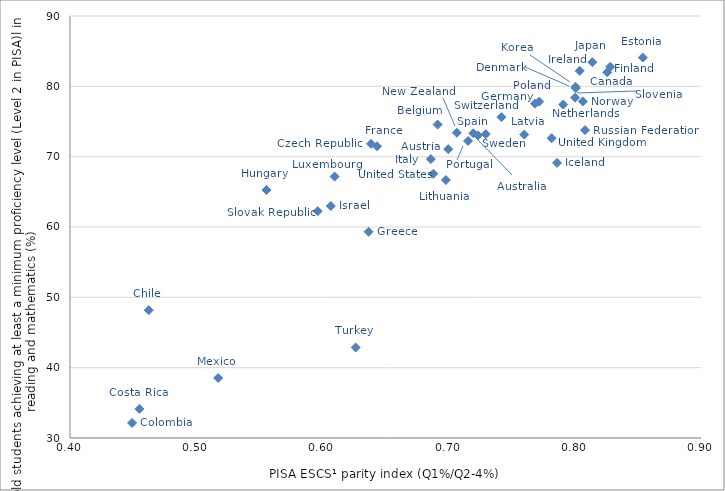
| Category | Series 0 |
|---|---|
| 0.7232025255039501 | 73.027 |
| 0.699720443026684 | 71.063 |
| 0.6912800510626963 | 74.567 |
| 0.8257372131532956 | 81.994 |
| 0.4624121630079085 | 48.173 |
| 0.6385534233579042 | 71.821 |
| 0.8007738140903365 | 79.747 |
| 0.8538689970449236 | 84.093 |
| 0.8280898209814422 | 82.779 |
| 0.6433073926419468 | 71.476 |
| 0.7684666466488747 | 77.535 |
| 0.6365924022783412 | 59.326 |
| 0.5556563185896167 | 65.264 |
| 0.7859101264931941 | 69.108 |
| 0.8039063117780979 | 82.199 |
| 0.606676154094499 | 62.988 |
| 0.6859626180756007 | 69.653 |
| 0.8139273993063922 | 83.432 |
| 0.8005627107478951 | 79.931 |
| 0.7599564454908343 | 73.144 |
| 0.6096784295064697 | 67.169 |
| 0.517380702792817 | 38.535 |
| 0.7908174504105685 | 77.405 |
| 0.7065288105436455 | 73.398 |
| 0.8063804020463634 | 77.857 |
| 0.7718560866668369 | 77.837 |
| 0.7154058393614803 | 72.231 |
| 0.5963307642542923 | 62.248 |
| 0.8002062219844985 | 78.384 |
| 0.7195924854270346 | 73.321 |
| 0.7294635683825235 | 73.202 |
| 0.741823624635157 | 75.624 |
| 0.6263828453824365 | 42.869 |
| 0.7816445477438897 | 72.626 |
| 0.6879233291739033 | 67.571 |
| 0.3621671668190608 | 26.482 |
| 0.449204509996012 | 32.145 |
| 0.4550167375312653 | 34.137 |
| 0.6978553302074371 | 66.675 |
| 0.808149197585458 | 73.776 |